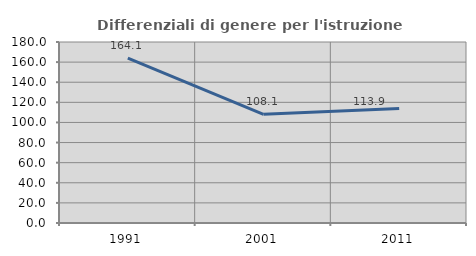
| Category | Differenziali di genere per l'istruzione superiore |
|---|---|
| 1991.0 | 164.073 |
| 2001.0 | 108.105 |
| 2011.0 | 113.916 |